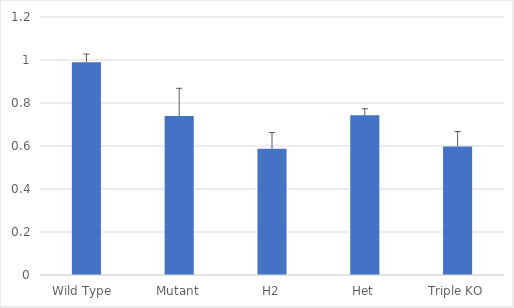
| Category | Series 0 |
|---|---|
| Wild Type  | 0.99 |
| Mutant | 0.74 |
| H2 | 0.587 |
| Het | 0.742 |
| Triple KO | 0.598 |